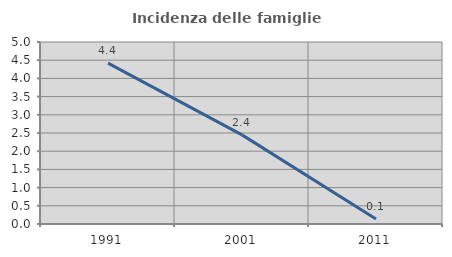
| Category | Incidenza delle famiglie numerose |
|---|---|
| 1991.0 | 4.418 |
| 2001.0 | 2.449 |
| 2011.0 | 0.135 |